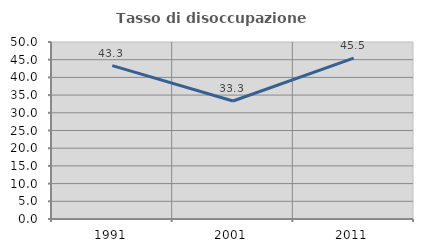
| Category | Tasso di disoccupazione giovanile  |
|---|---|
| 1991.0 | 43.333 |
| 2001.0 | 33.333 |
| 2011.0 | 45.455 |